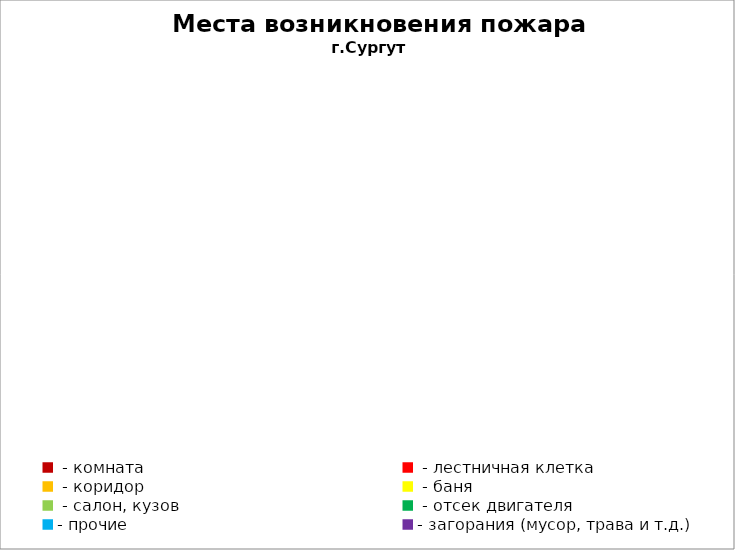
| Category | Места возникновения пожара |
|---|---|
|  - комната | 18 |
|  - лестничная клетка | 1 |
|  - коридор | 1 |
|  - баня | 2 |
|  - салон, кузов | 4 |
|  - отсек двигателя | 5 |
| - прочие | 14 |
| - загорания (мусор, трава и т.д.)  | 10 |